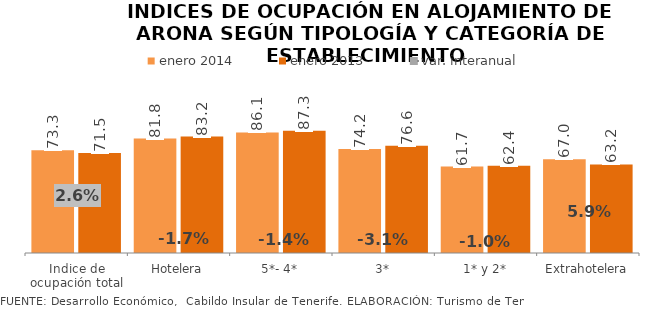
| Category | enero 2014 | enero 2013 |
|---|---|---|
| Indice de ocupación total | 73.31 | 71.479 |
| Hotelera | 81.76 | 83.196 |
| 5*- 4* | 86.102 | 87.299 |
| 3* | 74.23 | 76.624 |
| 1* y 2* | 61.727 | 62.369 |
| Extrahotelera | 66.95 | 63.215 |